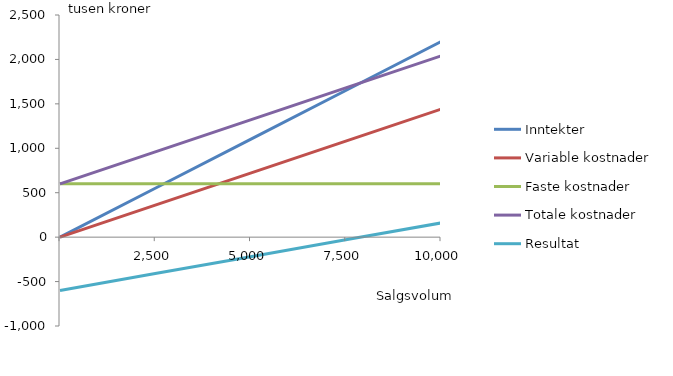
| Category | Inntekter | Variable kostnader | Faste kostnader | Totale kostnader | Resultat |
|---|---|---|---|---|---|
| nan | 0 | 0 | 600 | 600 | -600 |
| 2500.0 | 550 | 360 | 600 | 960 | -410 |
| 5000.0 | 1100 | 720 | 600 | 1320 | -220 |
| 7500.0 | 1650 | 1080 | 600 | 1680 | -30 |
| 10000.0 | 2200 | 1440 | 600 | 2040 | 160 |